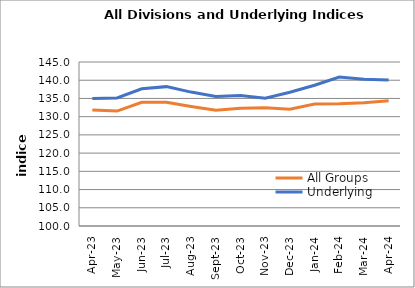
| Category | All Groups | Underlying |
|---|---|---|
| 2023-04-01 | 131.818 | 135.004 |
| 2023-05-01 | 131.529 | 135.152 |
| 2023-06-01 | 133.949 | 137.668 |
| 2023-07-01 | 133.98 | 138.239 |
| 2023-08-01 | 132.815 | 136.741 |
| 2023-09-01 | 131.755 | 135.527 |
| 2023-10-01 | 132.325 | 135.839 |
| 2023-11-01 | 132.443 | 135.05 |
| 2023-12-01 | 132.033 | 136.685 |
| 2024-01-01 | 133.445 | 138.608 |
| 2024-02-01 | 133.518 | 140.865 |
| 2024-03-01 | 133.802 | 140.291 |
| 2024-04-01 | 134.352 | 140.086 |